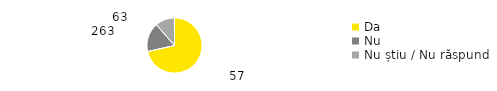
| Category | Total |
|---|---|
| Da | 0.715 |
| Nu | 0.171 |
| Nu știu / Nu răspund | 0.114 |